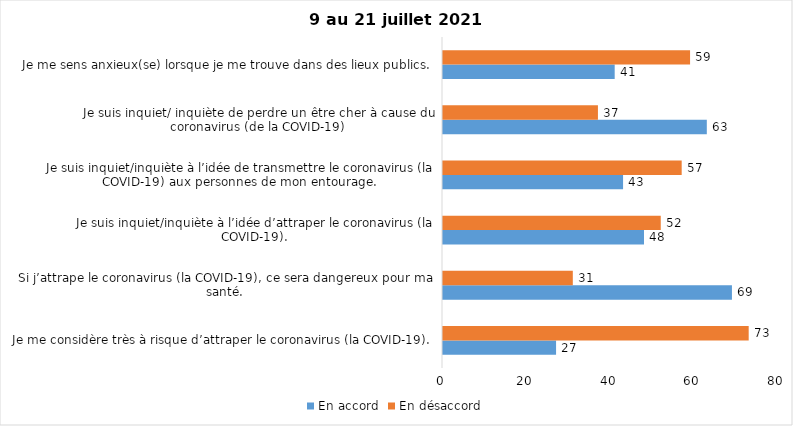
| Category | En accord | En désaccord |
|---|---|---|
| Je me considère très à risque d’attraper le coronavirus (la COVID-19). | 27 | 73 |
| Si j’attrape le coronavirus (la COVID-19), ce sera dangereux pour ma santé. | 69 | 31 |
| Je suis inquiet/inquiète à l’idée d’attraper le coronavirus (la COVID-19). | 48 | 52 |
| Je suis inquiet/inquiète à l’idée de transmettre le coronavirus (la COVID-19) aux personnes de mon entourage. | 43 | 57 |
| Je suis inquiet/ inquiète de perdre un être cher à cause du coronavirus (de la COVID-19) | 63 | 37 |
| Je me sens anxieux(se) lorsque je me trouve dans des lieux publics. | 41 | 59 |